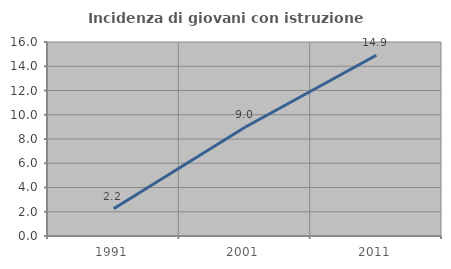
| Category | Incidenza di giovani con istruzione universitaria |
|---|---|
| 1991.0 | 2.246 |
| 2001.0 | 8.97 |
| 2011.0 | 14.908 |